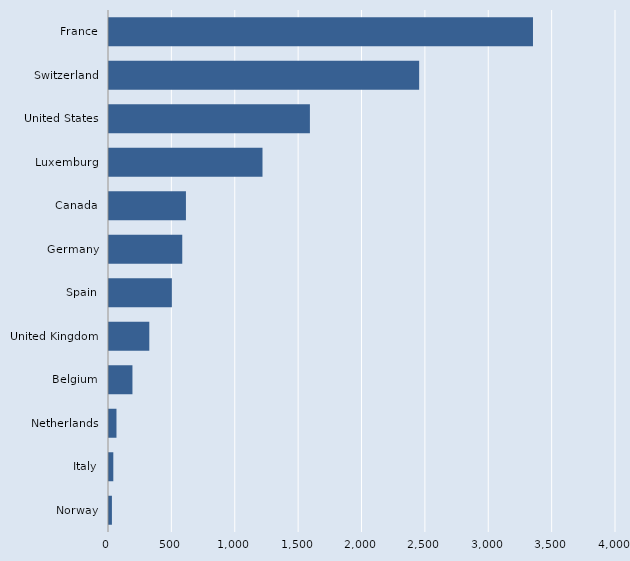
| Category | Series 0 |
|---|---|
| Norway | 23 |
| Italy | 34 |
| Netherlands | 59 |
| Belgium | 185 |
| United Kingdom | 318 |
| Spain | 496 |
| Germany | 578 |
| Canada | 607 |
| Luxemburg | 1211 |
| United States | 1585 |
| Switzerland | 2447 |
| France | 3345 |